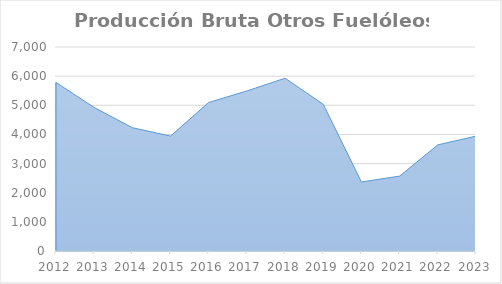
| Category | Otros Fuelóleos |
|---|---|
| 2012.0 | 5783.878 |
| 2013.0 | 4925.355 |
| 2014.0 | 4231.14 |
| 2015.0 | 3943.24 |
| 2016.0 | 5097.184 |
| 2017.0 | 5491.237 |
| 2018.0 | 5929.733 |
| 2019.0 | 5032.236 |
| 2020.0 | 2367.299 |
| 2021.0 | 2569.741 |
| 2022.0 | 3641.92 |
| 2023.0 | 3941.161 |